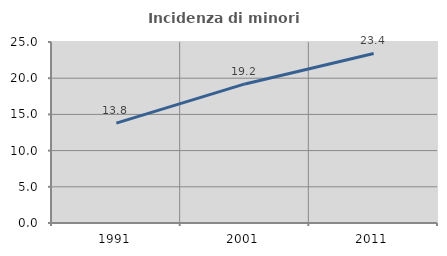
| Category | Incidenza di minori stranieri |
|---|---|
| 1991.0 | 13.793 |
| 2001.0 | 19.209 |
| 2011.0 | 23.421 |